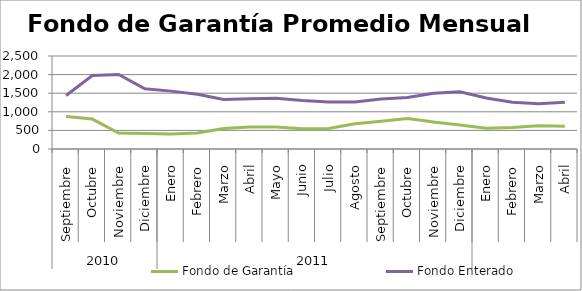
| Category | Fondo de Garantía | Fondo Enterado |
|---|---|---|
| 0 | 871.43 | 1439.553 |
| 1 | 804.208 | 1973.732 |
| 2 | 428.758 | 2004.096 |
| 3 | 417.974 | 1620.905 |
| 4 | 403.651 | 1555.632 |
| 5 | 429.02 | 1474.054 |
| 6 | 551.344 | 1328.521 |
| 7 | 591.732 | 1351.463 |
| 8 | 591.784 | 1363.301 |
| 9 | 544.875 | 1304.985 |
| 10 | 551.606 | 1265.502 |
| 11 | 679.839 | 1266.018 |
| 12 | 747.74 | 1344.929 |
| 13 | 819.75 | 1383.171 |
| 14 | 723.635 | 1501.378 |
| 15 | 648.288 | 1537.485 |
| 16 | 560.173 | 1370.992 |
| 17 | 575.916 | 1258.831 |
| 18 | 622.075 | 1216.471 |
| 19 | 612.299 | 1258.963 |